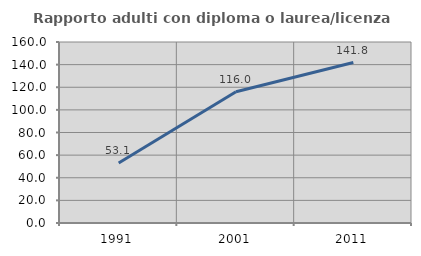
| Category | Rapporto adulti con diploma o laurea/licenza media  |
|---|---|
| 1991.0 | 53.107 |
| 2001.0 | 115.976 |
| 2011.0 | 141.848 |